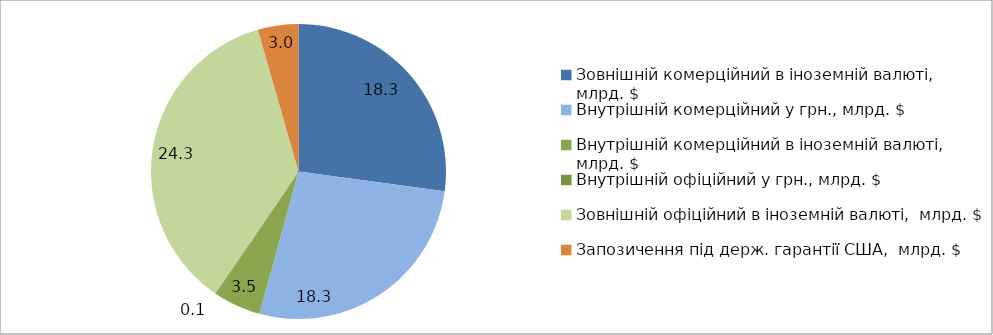
| Category | Series 0 |
|---|---|
| Зовнішній комерційний в іноземній валюті,  млрд. $ | 18.32 |
| Внутрішній комерційний у грн., млрд. $ | 18.33 |
| Внутрішній комерційний в іноземній валюті,  млрд. $ | 3.45 |
| Внутрішній офіційний у грн., млрд. $ | 0.1 |
| Зовнішній офіційний в іноземній валюті,  млрд. $ | 24.34 |
| Запозичення під держ. гарантії США,  млрд. $ | 3 |